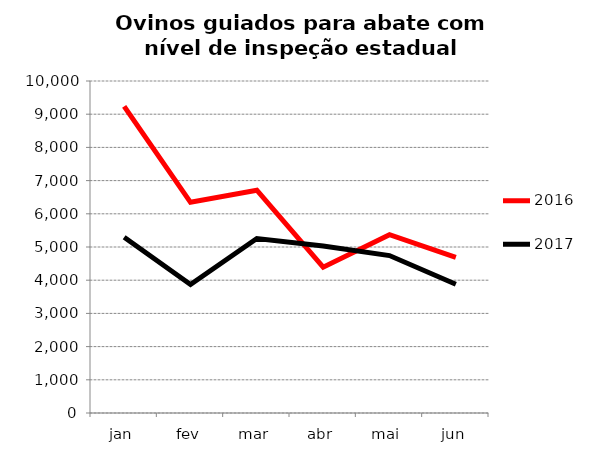
| Category | 2016 | 2017 |
|---|---|---|
| jan | 9236 | 5294 |
| fev | 6346 | 3872 |
| mar | 6711 | 5255 |
| abr | 4392 | 5033 |
| mai | 5372 | 4742 |
| jun | 4689 | 3878 |